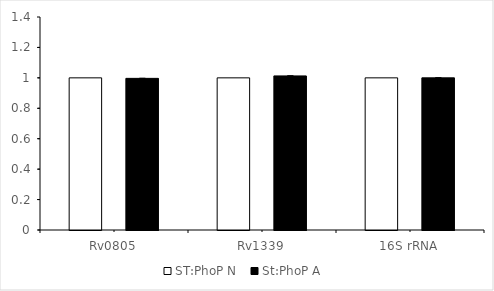
| Category | ST:PhoP N  | St:PhoP A  |
|---|---|---|
| Rv0805 | 1 | 0.997 |
| Rv1339 | 1 | 1.013 |
| 16S rRNA | 1 | 1 |